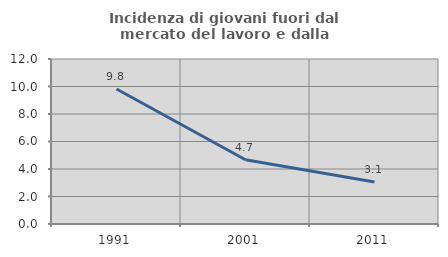
| Category | Incidenza di giovani fuori dal mercato del lavoro e dalla formazione  |
|---|---|
| 1991.0 | 9.821 |
| 2001.0 | 4.673 |
| 2011.0 | 3.061 |